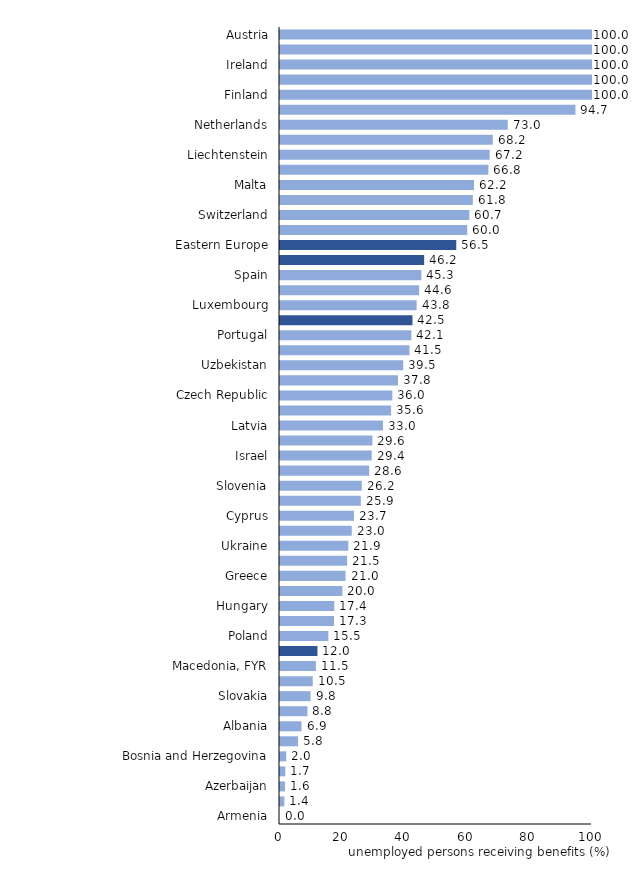
| Category | Unemployed persons receiving benefits, % |
|---|---|
| Armenia | 0 |
| Turkey | 1.4 |
| Azerbaijan | 1.6 |
| Kyrgyzstan | 1.7 |
| Bosnia and Herzegovina | 2 |
| Kazakhstan | 5.8 |
| Albania | 6.9 |
| Serbia | 8.8 |
| Slovakia | 9.8 |
| Moldova, Republic of | 10.5 |
| Macedonia, FYR | 11.5 |
| Central and Western Asia | 12.006 |
| Poland | 15.5 |
| Tajikistan | 17.3 |
| Hungary | 17.4 |
| Croatia | 20 |
| Greece | 21 |
| Lithuania | 21.5 |
| Ukraine | 21.9 |
| Romania | 23 |
| Cyprus | 23.7 |
| Sweden | 25.9 |
| Slovenia | 26.2 |
| Iceland | 28.6 |
| Israel | 29.4 |
| Bulgaria | 29.6 |
| Latvia | 33 |
| Montenegro | 35.6 |
| Czech Republic | 36 |
| Italy | 37.8 |
| Uzbekistan | 39.5 |
| Estonia | 41.5 |
| Portugal | 42.1 |
| Europe and Central Asia | 42.452 |
| Luxembourg | 43.8 |
| Belarus | 44.6 |
| Spain | 45.3 |
| Northern, Southern and Western Europe | 46.203 |
| Eastern Europe | 56.495 |
| United Kingdom | 60 |
| Switzerland | 60.7 |
| Norway | 61.8 |
| Malta | 62.2 |
| Denmark | 66.8 |
| Liechtenstein | 67.2 |
| Russian Federation | 68.2 |
| Netherlands | 73 |
| France | 94.7 |
| Finland | 100 |
| Belgium | 100 |
| Ireland | 100 |
| Germany | 100 |
| Austria | 100 |